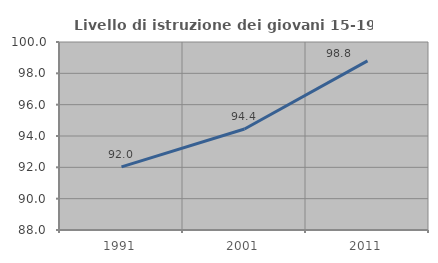
| Category | Livello di istruzione dei giovani 15-19 anni |
|---|---|
| 1991.0 | 92.029 |
| 2001.0 | 94.444 |
| 2011.0 | 98.795 |